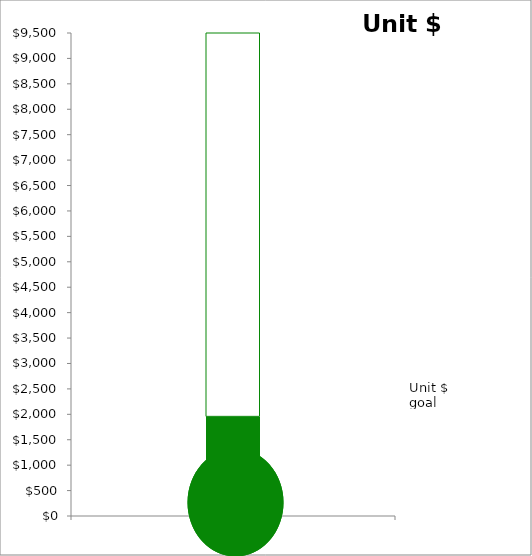
| Category | TOTAL | Unit $ goal |
|---|---|---|
| 0 | 1950 | 9500 |